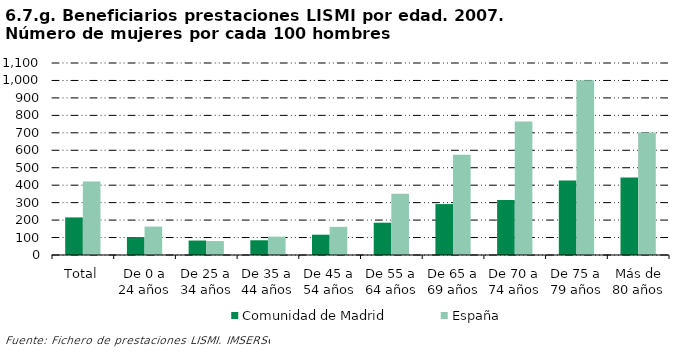
| Category | Comunidad de Madrid | España |
|---|---|---|
| Total | 215.411 | 421.064 |
| De 0 a 24 años | 102.632 | 162.697 |
| De 25 a 34 años | 82.812 | 79.795 |
| De 35 a 44 años | 84.422 | 105.069 |
| De 45 a 54 años | 116.3 | 161.168 |
| De 55 a 64 años | 185.075 | 351.536 |
| De 65 a 69 años | 291.667 | 574.259 |
| De 70 a 74 años | 314.407 | 764.276 |
| De 75 a 79 años | 426.214 | 1001.651 |
| Más de 80 años | 443.802 | 702.081 |